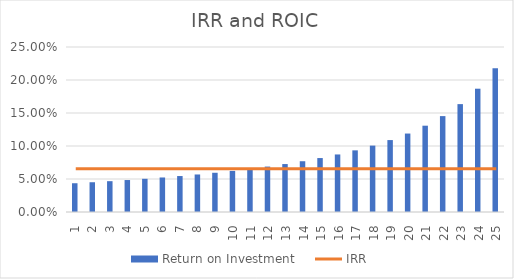
| Category | Return on Investment |
|---|---|
| 1.0 | 0.044 |
| 2.0 | 0.045 |
| 3.0 | 0.047 |
| 4.0 | 0.048 |
| 5.0 | 0.05 |
| 6.0 | 0.052 |
| 7.0 | 0.054 |
| 8.0 | 0.057 |
| 9.0 | 0.059 |
| 10.0 | 0.062 |
| 11.0 | 0.065 |
| 12.0 | 0.069 |
| 13.0 | 0.073 |
| 14.0 | 0.077 |
| 15.0 | 0.082 |
| 16.0 | 0.087 |
| 17.0 | 0.093 |
| 18.0 | 0.101 |
| 19.0 | 0.109 |
| 20.0 | 0.119 |
| 21.0 | 0.131 |
| 22.0 | 0.145 |
| 23.0 | 0.163 |
| 24.0 | 0.187 |
| 25.0 | 0.218 |